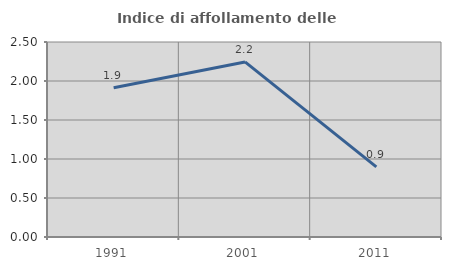
| Category | Indice di affollamento delle abitazioni  |
|---|---|
| 1991.0 | 1.913 |
| 2001.0 | 2.244 |
| 2011.0 | 0.899 |